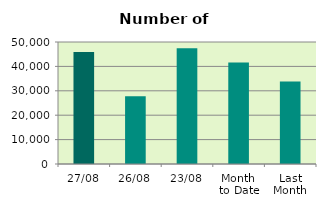
| Category | Series 0 |
|---|---|
| 27/08 | 45916 |
| 26/08 | 27812 |
| 23/08 | 47450 |
| Month 
to Date | 41608.421 |
| Last
Month | 33803.652 |